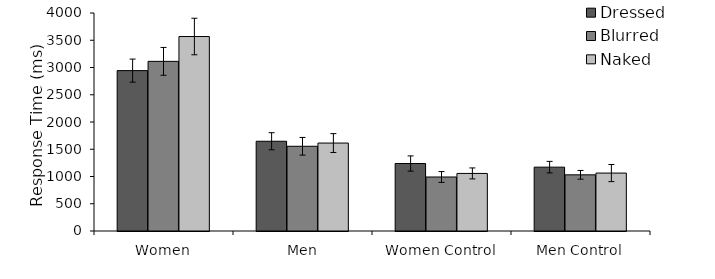
| Category | Dressed | Blurred | Naked |
|---|---|---|---|
| Women | 2942.74 | 3112.9 | 3568.52 |
|  Men | 1646.765 | 1554.725 | 1613.71 |
| Women Control | 1238.135 | 991.068 | 1056.363 |
| Men Control | 1171.673 | 1030.623 | 1062.932 |